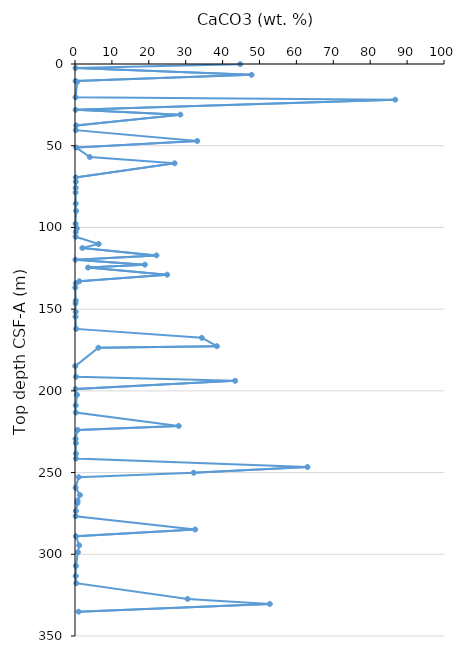
| Category | Series 0 |
|---|---|
| 44.774 | 0.09 |
| 0.15 | 2.45 |
| 47.839 | 6.64 |
| 0.15 | 10.4 |
| 0.566 | 11 |
| 0.158 | 20.37 |
| 86.799 | 21.84 |
| 0.158 | 28.06 |
| 28.564 | 30.99 |
| 0.325 | 37.56 |
| 0.233 | 40.48 |
| 33.128 | 47.1 |
| 0.325 | 51.15 |
| 4.015 | 56.91 |
| 27.006 | 60.75 |
| 0.208 | 69.4 |
| 0.208 | 72.11 |
| 0.183 | 75.82 |
| 0.158 | 78.63 |
| 0.2 | 85.41 |
| 0.308 | 89.91 |
| 0.158 | 97.78 |
| 0.508 | 100.59 |
| 0.2 | 102.8 |
| 0.175 | 105.71 |
| 6.397 | 110.13 |
| 1.991 | 112.6 |
| 22.083 | 117.11 |
| 0.125 | 119.74 |
| 18.934 | 122.79 |
| 3.549 | 124.55 |
| 24.973 | 128.93 |
| 1.175 | 132.92 |
| 0.233 | 134.15 |
| 0.075 | 136.82 |
| 0.208 | 144.84 |
| 0.142 | 146.48 |
| 0.183 | 151.66 |
| 0.142 | 154.61 |
| 0.317 | 162.1 |
| 34.37 | 167.56 |
| 38.46 | 172.66 |
| 6.331 | 173.63 |
| 0.067 | 184.87 |
| 0.25 | 191.39 |
| 43.399 | 193.86 |
| 0.15 | 198.92 |
| 0.541 | 202.43 |
| 0.208 | 208.85 |
| 0.233 | 213.27 |
| 28.105 | 221.46 |
| 0.725 | 223.94 |
| 0.158 | 229.39 |
| 0.242 | 231.96 |
| 0.258 | 238.44 |
| 0.258 | 241.45 |
| 63.0 | 246.6 |
| 32.17 | 250.12 |
| 0.975 | 252.81 |
| 0.167 | 259.31 |
| 1.333 | 263.76 |
| 0.7 | 267.12 |
| 0.666 | 268.62 |
| 0.233 | 273.52 |
| 0.183 | 276.71 |
| 32.579 | 284.82 |
| 0.258 | 288.95 |
| 1.133 | 294.51 |
| 0.783 | 298.74 |
| 0.25 | 307.06 |
| 0.192 | 313.3 |
| 0.342 | 317.7 |
| 30.521 | 327.32 |
| 52.796 | 330.4 |
| 0.966 | 335.12 |